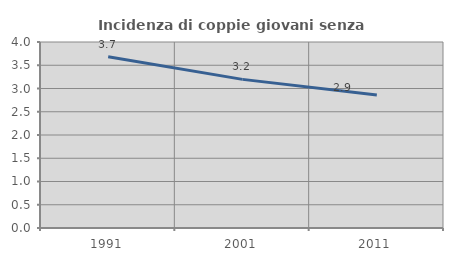
| Category | Incidenza di coppie giovani senza figli |
|---|---|
| 1991.0 | 3.682 |
| 2001.0 | 3.196 |
| 2011.0 | 2.86 |